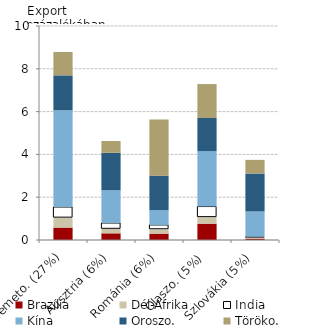
| Category | Brazília | Dél-Afrika | India | Kína | Oroszo. | Töröko. |
|---|---|---|---|---|---|---|
| Németo. (27%) | 0.58 | 0.464 | 0.496 | 4.516 | 1.636 | 1.092 |
| Ausztria (6%) | 0.312 | 0.211 | 0.271 | 1.531 | 1.75 | 0.551 |
| Románia (6%) | 0.297 | 0.205 | 0.201 | 0.685 | 1.617 | 2.629 |
| Olaszo. (5%) | 0.763 | 0.306 | 0.494 | 2.594 | 1.547 | 1.584 |
| Szlovákia (5%) | 0.064 | 0.059 | 0.026 | 1.184 | 1.773 | 0.639 |